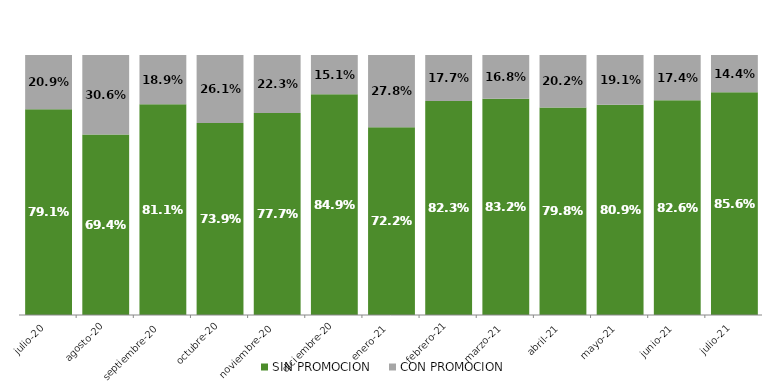
| Category | SIN PROMOCION   | CON PROMOCION   |
|---|---|---|
| 2020-07-01 | 0.791 | 0.209 |
| 2020-08-01 | 0.694 | 0.306 |
| 2020-09-01 | 0.811 | 0.189 |
| 2020-10-01 | 0.739 | 0.261 |
| 2020-11-01 | 0.777 | 0.223 |
| 2020-12-01 | 0.849 | 0.151 |
| 2021-01-01 | 0.722 | 0.278 |
| 2021-02-01 | 0.823 | 0.177 |
| 2021-03-01 | 0.832 | 0.168 |
| 2021-04-01 | 0.798 | 0.202 |
| 2021-05-01 | 0.809 | 0.191 |
| 2021-06-01 | 0.826 | 0.174 |
| 2021-07-01 | 0.856 | 0.144 |